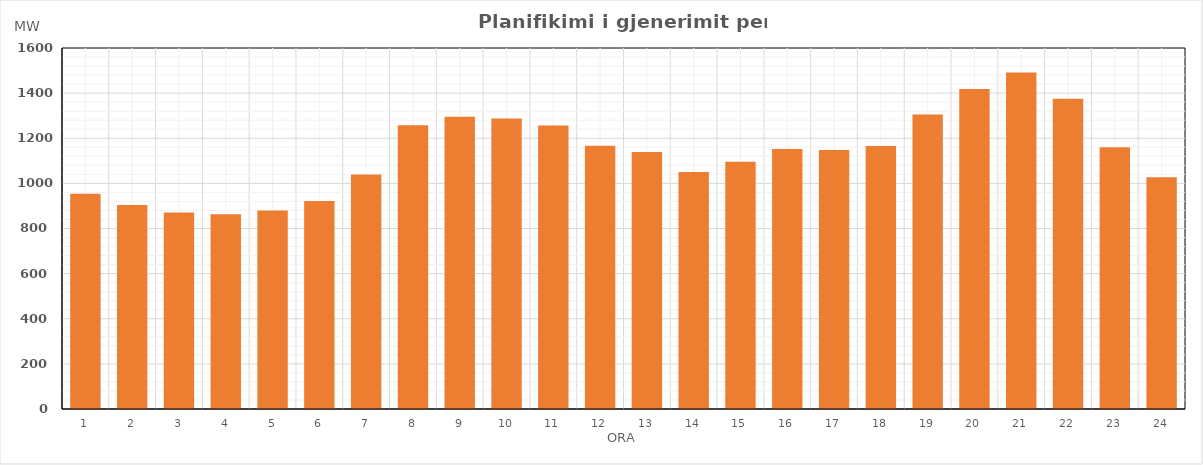
| Category | Max (MW) |
|---|---|
| 0 | 953.73 |
| 1 | 904.61 |
| 2 | 871.01 |
| 3 | 863.3 |
| 4 | 879.9 |
| 5 | 921.74 |
| 6 | 1039.29 |
| 7 | 1257.99 |
| 8 | 1295.69 |
| 9 | 1287.96 |
| 10 | 1256.98 |
| 11 | 1166.24 |
| 12 | 1139.04 |
| 13 | 1050.14 |
| 14 | 1095.72 |
| 15 | 1152 |
| 16 | 1148.02 |
| 17 | 1165.33 |
| 18 | 1305.63 |
| 19 | 1418.46 |
| 20 | 1491.43 |
| 21 | 1374.53 |
| 22 | 1160.31 |
| 23 | 1027.32 |